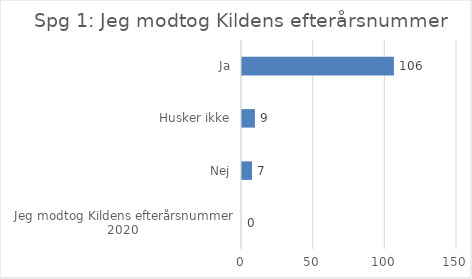
| Category | Series 0 |
|---|---|
| Jeg modtog Kildens efterårsnummer 2020 | 0 |
| Nej | 7 |
| Husker ikke | 9 |
| Ja | 106 |